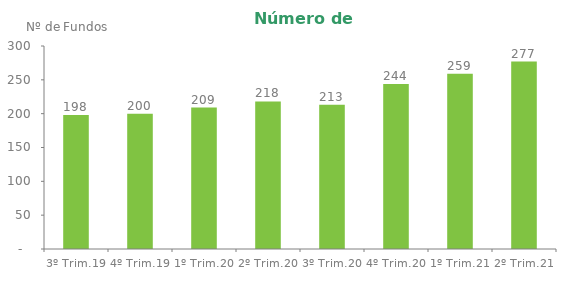
| Category | Series 0 |
|---|---|
| 3º Trim.19 | 198 |
| 4º Trim.19 | 200 |
| 1º Trim.20 | 209 |
| 2º Trim.20 | 218 |
| 3º Trim.20 | 213 |
| 4º Trim.20 | 244 |
| 1º Trim.21 | 259 |
| 2º Trim.21 | 277 |